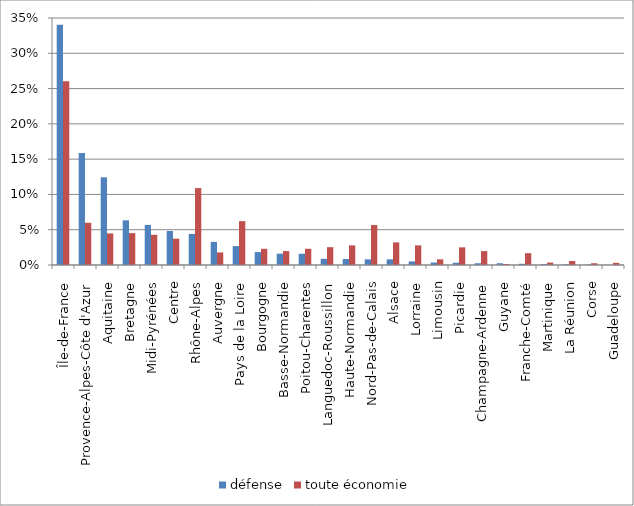
| Category | défense | toute économie |
|---|---|---|
| Île-de-France | 0.34 | 0.26 |
| Provence-Alpes-Côte d'Azur | 0.159 | 0.06 |
| Aquitaine | 0.124 | 0.045 |
| Bretagne | 0.063 | 0.045 |
| Midi-Pyrénées | 0.057 | 0.043 |
| Centre | 0.048 | 0.037 |
| Rhône-Alpes | 0.044 | 0.109 |
| Auvergne | 0.033 | 0.018 |
| Pays de la Loire | 0.027 | 0.062 |
| Bourgogne | 0.018 | 0.023 |
| Basse-Normandie | 0.016 | 0.02 |
| Poitou-Charentes | 0.016 | 0.023 |
| Languedoc-Roussillon | 0.009 | 0.025 |
| Haute-Normandie | 0.009 | 0.028 |
| Nord-Pas-de-Calais | 0.008 | 0.057 |
| Alsace | 0.008 | 0.032 |
| Lorraine | 0.005 | 0.028 |
| Limousin | 0.003 | 0.008 |
| Picardie | 0.003 | 0.025 |
| Champagne-Ardenne | 0.002 | 0.02 |
| Guyane | 0.002 | 0.001 |
| Franche-Comté | 0.002 | 0.017 |
| Martinique | 0.001 | 0.003 |
| La Réunion | 0.001 | 0.006 |
| Corse | 0.001 | 0.003 |
| Guadeloupe | 0 | 0.003 |